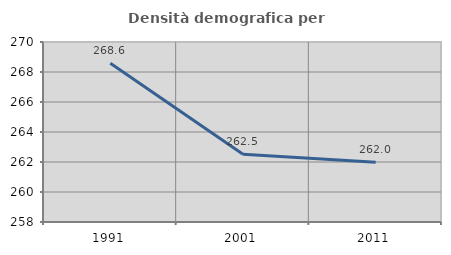
| Category | Densità demografica |
|---|---|
| 1991.0 | 268.58 |
| 2001.0 | 262.515 |
| 2011.0 | 261.98 |